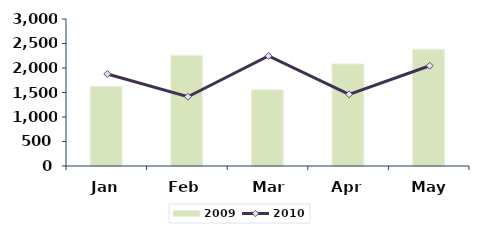
| Category | 2009 |
|---|---|
| Jan | 1628 |
| Feb | 2260 |
| Mar | 1555 |
| Apr | 2082 |
| May | 2385 |